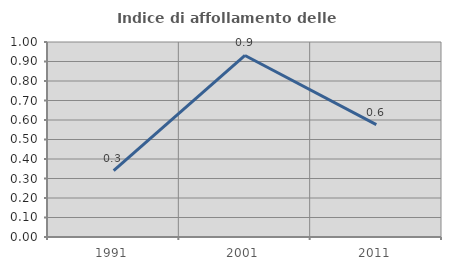
| Category | Indice di affollamento delle abitazioni  |
|---|---|
| 1991.0 | 0.341 |
| 2001.0 | 0.931 |
| 2011.0 | 0.576 |